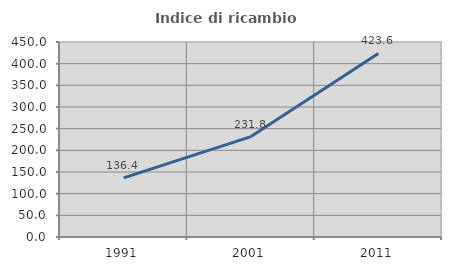
| Category | Indice di ricambio occupazionale  |
|---|---|
| 1991.0 | 136.416 |
| 2001.0 | 231.783 |
| 2011.0 | 423.611 |